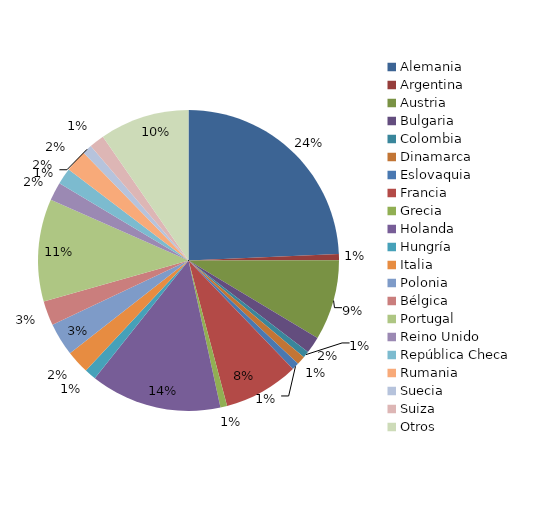
| Category | OEIs / Comisiones Rogatorias |
|---|---|
| Alemania | 1485 |
| Argentina | 40 |
| Austria | 527 |
| Bulgaria | 110 |
| Colombia | 42 |
| Dinamarca | 57 |
| Eslovaquia | 47 |
| Francia | 493 |
| Grecia | 44 |
| Holanda | 861 |
| Hungría | 76 |
| Italia | 152 |
| Polonia | 216 |
| Bélgica | 161 |
| Portugal | 672 |
| Reino Unido  | 121 |
| República Checa | 107 |
| Rumania | 145 |
| Suecia | 63 |
| Suiza | 99 |
| Otros | 588 |